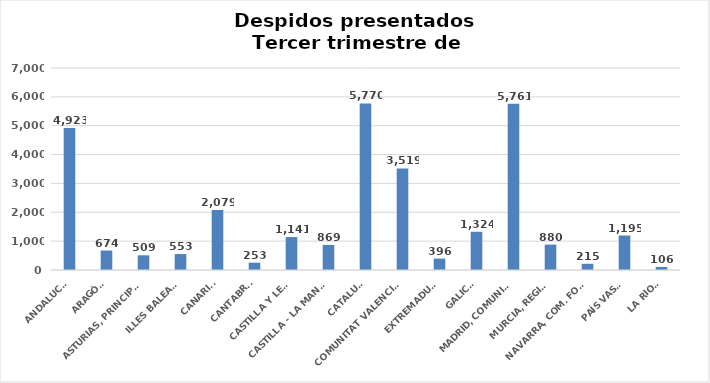
| Category | Series 0 |
|---|---|
| ANDALUCÍA | 4923 |
| ARAGÓN | 674 |
| ASTURIAS, PRINCIPADO | 509 |
| ILLES BALEARS | 553 |
| CANARIAS | 2079 |
| CANTABRIA | 253 |
| CASTILLA Y LEÓN | 1141 |
| CASTILLA - LA MANCHA | 869 |
| CATALUÑA | 5770 |
| COMUNITAT VALENCIANA | 3519 |
| EXTREMADURA | 396 |
| GALICIA | 1324 |
| MADRID, COMUNIDAD | 5761 |
| MURCIA, REGIÓN | 880 |
| NAVARRA, COM. FORAL | 215 |
| PAÍS VASCO | 1195 |
| LA RIOJA | 106 |